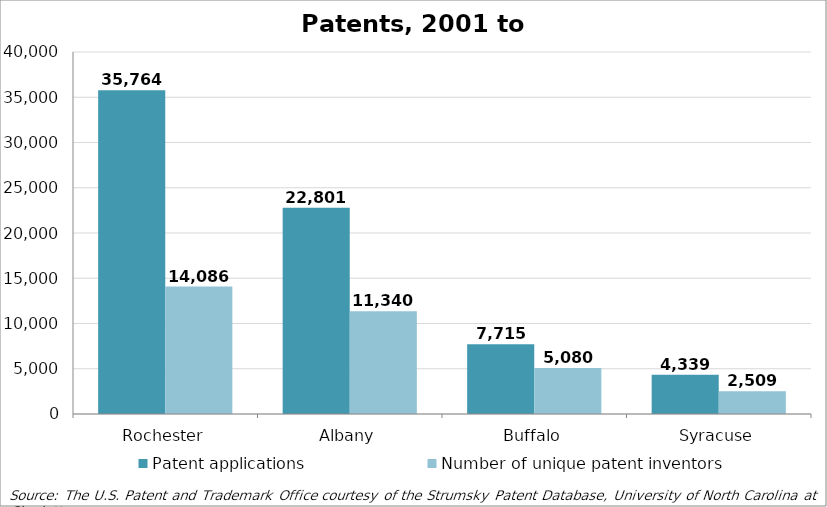
| Category | Patent applications  | Number of unique patent inventors |
|---|---|---|
| Rochester | 35764 | 14086 |
| Albany | 22801 | 11340 |
| Buffalo | 7715 | 5080 |
| Syracuse | 4339 | 2509 |